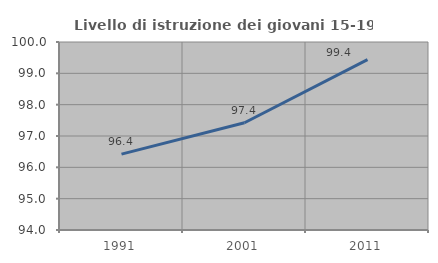
| Category | Livello di istruzione dei giovani 15-19 anni |
|---|---|
| 1991.0 | 96.422 |
| 2001.0 | 97.424 |
| 2011.0 | 99.44 |